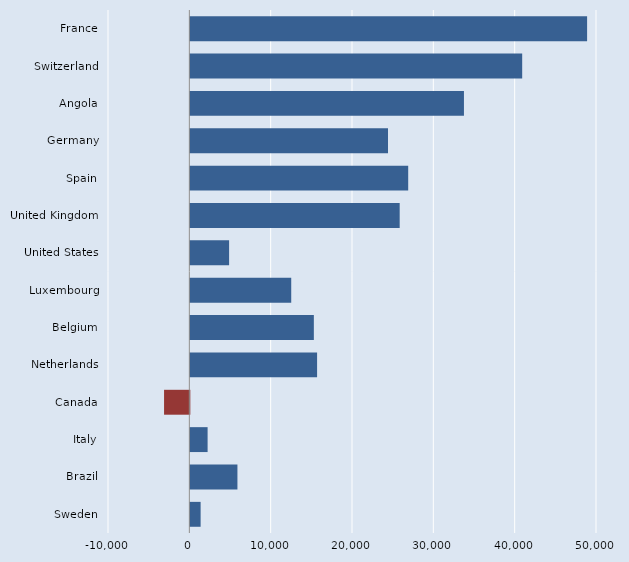
| Category | Series 0 |
|---|---|
| France | 48783 |
| Switzerland | 40802 |
| Angola | 33641 |
| Germany | 24304 |
| Spain | 26787 |
| United Kingdom | 25740 |
| United States | 4767 |
| Luxembourg | 12405 |
| Belgium | 15186 |
| Netherlands | 15585 |
| Canada | -3108 |
| Italy | 2123 |
| Brazil | 5791 |
| Sweden | 1265 |